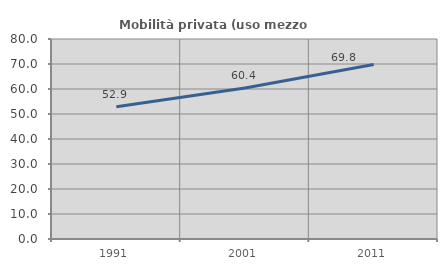
| Category | Mobilità privata (uso mezzo privato) |
|---|---|
| 1991.0 | 52.938 |
| 2001.0 | 60.401 |
| 2011.0 | 69.796 |